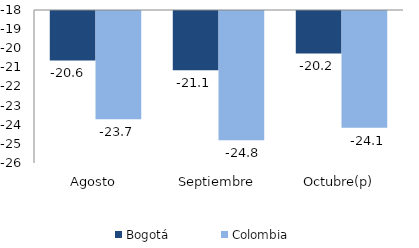
| Category | Bogotá | Colombia |
|---|---|---|
| Agosto | -20.588 | -23.658 |
| Septiembre | -21.101 | -24.755 |
| Octubre(p) | -20.216 | -24.107 |